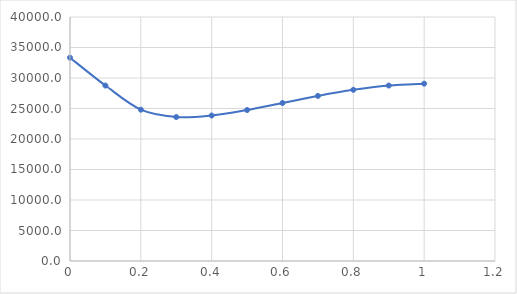
| Category | Series 0 |
|---|---|
| 0.0 | 33333.333 |
| 0.1 | 28762.695 |
| 0.2 | 24805.571 |
| 0.3 | 23603.145 |
| 0.4 | 23852.978 |
| 0.5 | 24751.861 |
| 0.6 | 25900.944 |
| 0.7 | 27062.375 |
| 0.8 | 28062.543 |
| 0.9 | 28765.141 |
| 1.0 | 29074.074 |